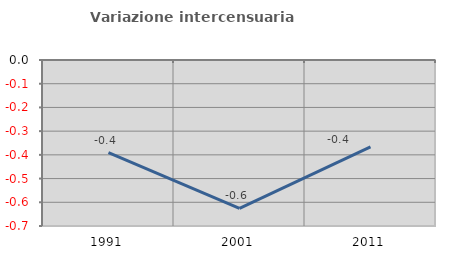
| Category | Variazione intercensuaria annua |
|---|---|
| 1991.0 | -0.39 |
| 2001.0 | -0.625 |
| 2011.0 | -0.366 |